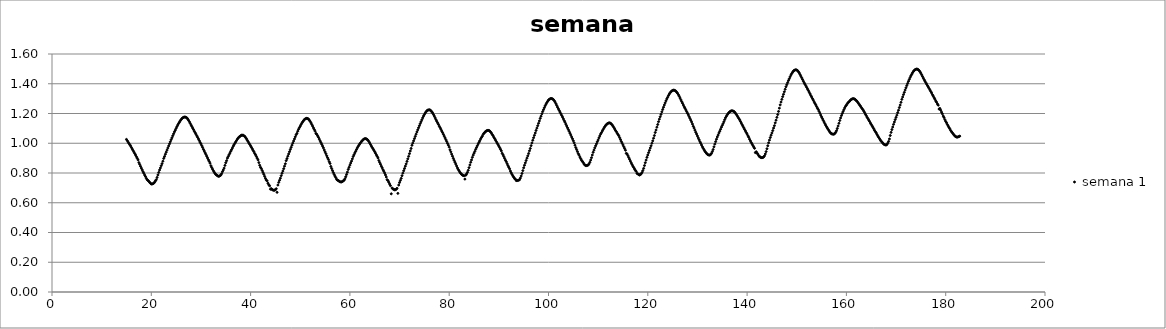
| Category | semana 1 |
|---|---|
| 15.0 | 1.026 |
| 15.16666 | 1.017 |
| 15.33332 | 1.008 |
| 15.49998 | 0.999 |
| 15.666640000000001 | 0.99 |
| 15.833300000000001 | 0.982 |
| 15.999960000000002 | 0.971 |
| 16.16662 | 0.961 |
| 16.333280000000002 | 0.951 |
| 16.499940000000002 | 0.941 |
| 16.666600000000003 | 0.931 |
| 16.833260000000003 | 0.921 |
| 16.999920000000003 | 0.91 |
| 17.166580000000003 | 0.899 |
| 17.333240000000004 | 0.888 |
| 17.499900000000004 | 0.87 |
| 17.666560000000004 | 0.858 |
| 17.833220000000004 | 0.845 |
| 17.999880000000005 | 0.833 |
| 18.166540000000005 | 0.821 |
| 18.333200000000005 | 0.809 |
| 18.499860000000005 | 0.798 |
| 18.666520000000006 | 0.786 |
| 18.833180000000006 | 0.776 |
| 18.999840000000006 | 0.764 |
| 19.166500000000006 | 0.755 |
| 19.333160000000007 | 0.75 |
| 19.499820000000007 | 0.744 |
| 19.666480000000007 | 0.737 |
| 19.833140000000007 | 0.731 |
| 19.999800000000008 | 0.726 |
| 20.166460000000008 | 0.726 |
| 20.333120000000008 | 0.728 |
| 20.49978000000001 | 0.732 |
| 20.66644000000001 | 0.738 |
| 20.83310000000001 | 0.747 |
| 20.99976000000001 | 0.755 |
| 21.16642000000001 | 0.77 |
| 21.33308000000001 | 0.787 |
| 21.49974000000001 | 0.804 |
| 21.66640000000001 | 0.82 |
| 21.83306000000001 | 0.834 |
| 21.99972000000001 | 0.849 |
| 22.16638000000001 | 0.863 |
| 22.33304000000001 | 0.879 |
| 22.49970000000001 | 0.898 |
| 22.66636000000001 | 0.911 |
| 22.833020000000012 | 0.926 |
| 22.999680000000012 | 0.94 |
| 23.166340000000012 | 0.954 |
| 23.333000000000013 | 0.968 |
| 23.499660000000013 | 0.982 |
| 23.666320000000013 | 0.996 |
| 23.832980000000013 | 1.01 |
| 23.999640000000014 | 1.024 |
| 24.166300000000014 | 1.037 |
| 24.332960000000014 | 1.051 |
| 24.499620000000014 | 1.064 |
| 24.666280000000015 | 1.077 |
| 24.832940000000015 | 1.088 |
| 24.999600000000015 | 1.1 |
| 25.166260000000015 | 1.112 |
| 25.332920000000016 | 1.123 |
| 25.499580000000016 | 1.133 |
| 25.666240000000016 | 1.142 |
| 25.832900000000016 | 1.151 |
| 25.999560000000017 | 1.159 |
| 26.166220000000017 | 1.166 |
| 26.332880000000017 | 1.171 |
| 26.499540000000017 | 1.174 |
| 26.666200000000018 | 1.176 |
| 26.832860000000018 | 1.176 |
| 26.999520000000018 | 1.174 |
| 27.16618000000002 | 1.17 |
| 27.33284000000002 | 1.163 |
| 27.49950000000002 | 1.155 |
| 27.66616000000002 | 1.145 |
| 27.83282000000002 | 1.134 |
| 27.99948000000002 | 1.123 |
| 28.16614000000002 | 1.113 |
| 28.33280000000002 | 1.102 |
| 28.49946000000002 | 1.092 |
| 28.66612000000002 | 1.081 |
| 28.83278000000002 | 1.071 |
| 28.99944000000002 | 1.061 |
| 29.16610000000002 | 1.05 |
| 29.33276000000002 | 1.04 |
| 29.499420000000022 | 1.029 |
| 29.666080000000022 | 1.018 |
| 29.832740000000022 | 1.006 |
| 29.999400000000023 | 0.996 |
| 30.166060000000023 | 0.984 |
| 30.332720000000023 | 0.972 |
| 30.499380000000023 | 0.959 |
| 30.666040000000024 | 0.948 |
| 30.832700000000024 | 0.936 |
| 30.999360000000024 | 0.925 |
| 31.166020000000024 | 0.913 |
| 31.332680000000025 | 0.901 |
| 31.499340000000025 | 0.889 |
| 31.666000000000025 | 0.878 |
| 31.832660000000025 | 0.866 |
| 31.999320000000026 | 0.849 |
| 32.165980000000026 | 0.837 |
| 32.332640000000026 | 0.826 |
| 32.49930000000003 | 0.815 |
| 32.66596000000003 | 0.806 |
| 32.83262000000003 | 0.797 |
| 32.99928000000003 | 0.79 |
| 33.16594000000003 | 0.786 |
| 33.33260000000003 | 0.782 |
| 33.49926000000003 | 0.778 |
| 33.66592000000003 | 0.778 |
| 33.83258000000003 | 0.782 |
| 33.99924000000003 | 0.786 |
| 34.16590000000003 | 0.795 |
| 34.33256000000003 | 0.809 |
| 34.49922000000003 | 0.82 |
| 34.66588000000003 | 0.833 |
| 34.83254000000003 | 0.851 |
| 34.99920000000003 | 0.869 |
| 35.16586000000003 | 0.883 |
| 35.33252000000003 | 0.9 |
| 35.49918000000003 | 0.911 |
| 35.66584000000003 | 0.923 |
| 35.83250000000003 | 0.934 |
| 35.99916000000003 | 0.946 |
| 36.16582000000003 | 0.957 |
| 36.33248000000003 | 0.968 |
| 36.49914000000003 | 0.98 |
| 36.66580000000003 | 0.99 |
| 36.83246000000003 | 1 |
| 36.99912000000003 | 1.009 |
| 37.165780000000034 | 1.018 |
| 37.332440000000034 | 1.028 |
| 37.499100000000034 | 1.035 |
| 37.665760000000034 | 1.041 |
| 37.832420000000035 | 1.046 |
| 37.999080000000035 | 1.05 |
| 38.165740000000035 | 1.054 |
| 38.332400000000035 | 1.054 |
| 38.499060000000036 | 1.054 |
| 38.665720000000036 | 1.05 |
| 38.832380000000036 | 1.046 |
| 38.999040000000036 | 1.038 |
| 39.16570000000004 | 1.03 |
| 39.33236000000004 | 1.02 |
| 39.49902000000004 | 1.011 |
| 39.66568000000004 | 1.001 |
| 39.83234000000004 | 0.992 |
| 39.99900000000004 | 0.982 |
| 40.16566000000004 | 0.973 |
| 40.33232000000004 | 0.963 |
| 40.49898000000004 | 0.952 |
| 40.66564000000004 | 0.943 |
| 40.83230000000004 | 0.931 |
| 40.99896000000004 | 0.922 |
| 41.16562000000004 | 0.911 |
| 41.33228000000004 | 0.899 |
| 41.49894000000004 | 0.888 |
| 41.66560000000004 | 0.87 |
| 41.83226000000004 | 0.852 |
| 41.99892000000004 | 0.838 |
| 42.16558000000004 | 0.83 |
| 42.33224000000004 | 0.817 |
| 42.49890000000004 | 0.804 |
| 42.66556000000004 | 0.791 |
| 42.83222000000004 | 0.777 |
| 42.99888000000004 | 0.763 |
| 43.16554000000004 | 0.752 |
| 43.33220000000004 | 0.747 |
| 43.49886000000004 | 0.731 |
| 43.66552000000004 | 0.72 |
| 43.832180000000044 | 0.714 |
| 43.998840000000044 | 0.691 |
| 44.165500000000044 | 0.695 |
| 44.332160000000044 | 0.689 |
| 44.498820000000045 | 0.685 |
| 44.665480000000045 | 0.684 |
| 44.832140000000045 | 0.684 |
| 44.998800000000045 | 0.688 |
| 45.165460000000046 | 0.694 |
| 45.332120000000046 | 0.67 |
| 45.498780000000046 | 0.719 |
| 45.665440000000046 | 0.737 |
| 45.83210000000005 | 0.751 |
| 45.99876000000005 | 0.765 |
| 46.16542000000005 | 0.782 |
| 46.33208000000005 | 0.798 |
| 46.49874000000005 | 0.813 |
| 46.66540000000005 | 0.829 |
| 46.83206000000005 | 0.846 |
| 46.99872000000005 | 0.862 |
| 47.16538000000005 | 0.883 |
| 47.33204000000005 | 0.897 |
| 47.49870000000005 | 0.913 |
| 47.66536000000005 | 0.928 |
| 47.83202000000005 | 0.943 |
| 47.99868000000005 | 0.958 |
| 48.16534000000005 | 0.972 |
| 48.33200000000005 | 0.987 |
| 48.49866000000005 | 1.001 |
| 48.66532000000005 | 1.015 |
| 48.83198000000005 | 1.029 |
| 48.99864000000005 | 1.043 |
| 49.16530000000005 | 1.057 |
| 49.33196000000005 | 1.066 |
| 49.49862000000005 | 1.081 |
| 49.66528000000005 | 1.094 |
| 49.83194000000005 | 1.105 |
| 49.99860000000005 | 1.115 |
| 50.16526000000005 | 1.126 |
| 50.33192000000005 | 1.136 |
| 50.498580000000054 | 1.144 |
| 50.665240000000054 | 1.152 |
| 50.831900000000054 | 1.159 |
| 50.998560000000055 | 1.164 |
| 51.165220000000055 | 1.166 |
| 51.331880000000055 | 1.168 |
| 51.498540000000055 | 1.166 |
| 51.665200000000056 | 1.162 |
| 51.831860000000056 | 1.155 |
| 51.998520000000056 | 1.147 |
| 52.165180000000056 | 1.137 |
| 52.33184000000006 | 1.126 |
| 52.49850000000006 | 1.115 |
| 52.66516000000006 | 1.103 |
| 52.83182000000006 | 1.092 |
| 52.99848000000006 | 1.081 |
| 53.16514000000006 | 1.066 |
| 53.33180000000006 | 1.06 |
| 53.49846000000006 | 1.05 |
| 53.66512000000006 | 1.04 |
| 53.83178000000006 | 1.028 |
| 53.99844000000006 | 1.016 |
| 54.16510000000006 | 1.005 |
| 54.33176000000006 | 0.993 |
| 54.49842000000006 | 0.981 |
| 54.66508000000006 | 0.969 |
| 54.83174000000006 | 0.955 |
| 54.99840000000006 | 0.942 |
| 55.16506000000006 | 0.93 |
| 55.33172000000006 | 0.916 |
| 55.49838000000006 | 0.903 |
| 55.66504000000006 | 0.891 |
| 55.83170000000006 | 0.876 |
| 55.99836000000006 | 0.864 |
| 56.16502000000006 | 0.844 |
| 56.33168000000006 | 0.83 |
| 56.49834000000006 | 0.816 |
| 56.66500000000006 | 0.803 |
| 56.83166000000006 | 0.79 |
| 56.998320000000064 | 0.779 |
| 57.164980000000064 | 0.769 |
| 57.331640000000064 | 0.757 |
| 57.498300000000064 | 0.752 |
| 57.664960000000065 | 0.749 |
| 57.831620000000065 | 0.745 |
| 57.998280000000065 | 0.741 |
| 58.164940000000065 | 0.74 |
| 58.331600000000066 | 0.74 |
| 58.498260000000066 | 0.743 |
| 58.664920000000066 | 0.748 |
| 58.831580000000066 | 0.751 |
| 58.99824000000007 | 0.761 |
| 59.16490000000007 | 0.775 |
| 59.33156000000007 | 0.79 |
| 59.49822000000007 | 0.806 |
| 59.66488000000007 | 0.824 |
| 59.83154000000007 | 0.838 |
| 59.99820000000007 | 0.853 |
| 60.16486000000007 | 0.867 |
| 60.33152000000007 | 0.88 |
| 60.49818000000007 | 0.895 |
| 60.66484000000007 | 0.911 |
| 60.83150000000007 | 0.923 |
| 60.99816000000007 | 0.935 |
| 61.16482000000007 | 0.946 |
| 61.33148000000007 | 0.958 |
| 61.49814000000007 | 0.969 |
| 61.66480000000007 | 0.979 |
| 61.83146000000007 | 0.988 |
| 61.99812000000007 | 0.996 |
| 62.16478000000007 | 1.004 |
| 62.33144000000007 | 1.012 |
| 62.49810000000007 | 1.017 |
| 62.66476000000007 | 1.024 |
| 62.83142000000007 | 1.028 |
| 62.99808000000007 | 1.031 |
| 63.16474000000007 | 1.031 |
| 63.33140000000007 | 1.029 |
| 63.49806000000007 | 1.025 |
| 63.664720000000074 | 1.019 |
| 63.831380000000074 | 1.011 |
| 63.998040000000074 | 1.001 |
| 64.16470000000007 | 0.991 |
| 64.33136000000006 | 0.981 |
| 64.49802000000005 | 0.971 |
| 64.66468000000005 | 0.962 |
| 64.83134000000004 | 0.953 |
| 64.99800000000003 | 0.943 |
| 65.16466000000003 | 0.933 |
| 65.33132000000002 | 0.922 |
| 65.49798000000001 | 0.912 |
| 65.66464 | 0.901 |
| 65.8313 | 0.884 |
| 65.99795999999999 | 0.871 |
| 66.16461999999999 | 0.859 |
| 66.33127999999998 | 0.846 |
| 66.49793999999997 | 0.835 |
| 66.66459999999996 | 0.822 |
| 66.83125999999996 | 0.812 |
| 66.99791999999995 | 0.8 |
| 67.16457999999994 | 0.787 |
| 67.33123999999994 | 0.773 |
| 67.49789999999993 | 0.755 |
| 67.66455999999992 | 0.749 |
| 67.83121999999992 | 0.738 |
| 67.99787999999991 | 0.726 |
| 68.1645399999999 | 0.715 |
| 68.3311999999999 | 0.66 |
| 68.49785999999989 | 0.699 |
| 68.66451999999988 | 0.693 |
| 68.83117999999988 | 0.69 |
| 68.99783999999987 | 0.687 |
| 69.16449999999986 | 0.688 |
| 69.33115999999985 | 0.691 |
| 69.49781999999985 | 0.697 |
| 69.66447999999984 | 0.663 |
| 69.83113999999983 | 0.719 |
| 69.99779999999983 | 0.736 |
| 70.16445999999982 | 0.75 |
| 70.33111999999981 | 0.764 |
| 70.4977799999998 | 0.782 |
| 70.6644399999998 | 0.799 |
| 70.8310999999998 | 0.815 |
| 70.99775999999979 | 0.83 |
| 71.16441999999978 | 0.846 |
| 71.33107999999977 | 0.861 |
| 71.49773999999977 | 0.878 |
| 71.66439999999976 | 0.895 |
| 71.83105999999975 | 0.912 |
| 71.99771999999975 | 0.93 |
| 72.16437999999974 | 0.948 |
| 72.33103999999973 | 0.965 |
| 72.49769999999972 | 0.986 |
| 72.66435999999972 | 1.001 |
| 72.83101999999971 | 1.016 |
| 72.9976799999997 | 1.031 |
| 73.1643399999997 | 1.046 |
| 73.33099999999969 | 1.061 |
| 73.49765999999968 | 1.076 |
| 73.66431999999968 | 1.09 |
| 73.83097999999967 | 1.104 |
| 73.99763999999966 | 1.118 |
| 74.16429999999966 | 1.132 |
| 74.33095999999965 | 1.145 |
| 74.49761999999964 | 1.158 |
| 74.66427999999964 | 1.171 |
| 74.83093999999963 | 1.183 |
| 74.99759999999962 | 1.193 |
| 75.16425999999962 | 1.203 |
| 75.33091999999961 | 1.211 |
| 75.4975799999996 | 1.218 |
| 75.6642399999996 | 1.222 |
| 75.83089999999959 | 1.224 |
| 75.99755999999958 | 1.225 |
| 76.16421999999957 | 1.223 |
| 76.33087999999957 | 1.218 |
| 76.49753999999956 | 1.211 |
| 76.66419999999955 | 1.204 |
| 76.83085999999955 | 1.193 |
| 76.99751999999954 | 1.183 |
| 77.16417999999953 | 1.171 |
| 77.33083999999953 | 1.159 |
| 77.49749999999952 | 1.148 |
| 77.66415999999951 | 1.137 |
| 77.8308199999995 | 1.127 |
| 77.9974799999995 | 1.115 |
| 78.16413999999949 | 1.105 |
| 78.33079999999948 | 1.094 |
| 78.49745999999948 | 1.082 |
| 78.66411999999947 | 1.072 |
| 78.83077999999946 | 1.06 |
| 78.99743999999946 | 1.048 |
| 79.16409999999945 | 1.036 |
| 79.33075999999944 | 1.024 |
| 79.49741999999944 | 1.012 |
| 79.66407999999943 | 0.999 |
| 79.83073999999942 | 0.987 |
| 79.99739999999942 | 0.974 |
| 80.16405999999941 | 0.956 |
| 80.3307199999994 | 0.942 |
| 80.4973799999994 | 0.927 |
| 80.66403999999939 | 0.913 |
| 80.83069999999938 | 0.898 |
| 80.99735999999938 | 0.885 |
| 81.16401999999937 | 0.872 |
| 81.33067999999936 | 0.86 |
| 81.49733999999935 | 0.847 |
| 81.66399999999935 | 0.834 |
| 81.83065999999934 | 0.823 |
| 81.99731999999933 | 0.814 |
| 82.16397999999933 | 0.805 |
| 82.33063999999932 | 0.797 |
| 82.49729999999931 | 0.791 |
| 82.6639599999993 | 0.786 |
| 82.8306199999993 | 0.783 |
| 82.9972799999993 | 0.782 |
| 83.16393999999929 | 0.759 |
| 83.33059999999928 | 0.785 |
| 83.49725999999927 | 0.793 |
| 83.66391999999927 | 0.804 |
| 83.83057999999926 | 0.818 |
| 83.99723999999925 | 0.836 |
| 84.16389999999924 | 0.854 |
| 84.33055999999924 | 0.872 |
| 84.49721999999923 | 0.888 |
| 84.66387999999922 | 0.905 |
| 84.83053999999922 | 0.92 |
| 84.99719999999921 | 0.933 |
| 85.1638599999992 | 0.945 |
| 85.3305199999992 | 0.959 |
| 85.49717999999919 | 0.971 |
| 85.66383999999918 | 0.983 |
| 85.83049999999918 | 0.995 |
| 85.99715999999917 | 1.006 |
| 86.16381999999916 | 1.017 |
| 86.33047999999916 | 1.029 |
| 86.49713999999915 | 1.039 |
| 86.66379999999914 | 1.047 |
| 86.83045999999914 | 1.059 |
| 86.99711999999913 | 1.067 |
| 87.16377999999912 | 1.073 |
| 87.33043999999911 | 1.079 |
| 87.49709999999911 | 1.083 |
| 87.6637599999991 | 1.086 |
| 87.8304199999991 | 1.087 |
| 87.99707999999909 | 1.086 |
| 88.16373999999908 | 1.082 |
| 88.33039999999907 | 1.076 |
| 88.49705999999907 | 1.069 |
| 88.66371999999906 | 1.059 |
| 88.83037999999905 | 1.051 |
| 88.99703999999905 | 1.04 |
| 89.16369999999904 | 1.031 |
| 89.33035999999903 | 1.021 |
| 89.49701999999903 | 1.011 |
| 89.66367999999902 | 1.001 |
| 89.83033999999901 | 0.991 |
| 89.996999999999 | 0.981 |
| 90.163659999999 | 0.971 |
| 90.33031999999899 | 0.96 |
| 90.49697999999898 | 0.949 |
| 90.66363999999898 | 0.933 |
| 90.83029999999897 | 0.923 |
| 90.99695999999896 | 0.911 |
| 91.16361999999896 | 0.898 |
| 91.33027999999895 | 0.886 |
| 91.49693999999894 | 0.876 |
| 91.66359999999894 | 0.863 |
| 91.83025999999893 | 0.85 |
| 91.99691999999892 | 0.839 |
| 92.16357999999892 | 0.828 |
| 92.33023999999891 | 0.813 |
| 92.4968999999989 | 0.801 |
| 92.6635599999989 | 0.79 |
| 92.83021999999889 | 0.78 |
| 92.99687999999888 | 0.772 |
| 93.16353999999887 | 0.763 |
| 93.33019999999887 | 0.759 |
| 93.49685999999886 | 0.749 |
| 93.66351999999885 | 0.75 |
| 93.83017999999885 | 0.75 |
| 93.99683999999884 | 0.752 |
| 94.16349999999883 | 0.755 |
| 94.33015999999883 | 0.766 |
| 94.49681999999882 | 0.78 |
| 94.66347999999881 | 0.797 |
| 94.8301399999988 | 0.816 |
| 94.9967999999988 | 0.835 |
| 95.16345999999879 | 0.852 |
| 95.33011999999879 | 0.868 |
| 95.49677999999878 | 0.884 |
| 95.66343999999877 | 0.9 |
| 95.83009999999877 | 0.915 |
| 95.99675999999876 | 0.931 |
| 96.16341999999875 | 0.949 |
| 96.33007999999874 | 0.965 |
| 96.49673999999874 | 0.984 |
| 96.66339999999873 | 1.002 |
| 96.83005999999872 | 1.02 |
| 96.99671999999872 | 1.037 |
| 97.16337999999871 | 1.053 |
| 97.3300399999987 | 1.069 |
| 97.4966999999987 | 1.086 |
| 97.66335999999869 | 1.102 |
| 97.83001999999868 | 1.118 |
| 97.99667999999868 | 1.134 |
| 98.16333999999867 | 1.15 |
| 98.32999999999866 | 1.167 |
| 98.49665999999866 | 1.182 |
| 98.66331999999865 | 1.198 |
| 98.82997999999864 | 1.213 |
| 98.99663999999864 | 1.226 |
| 99.16329999999863 | 1.239 |
| 99.32995999999862 | 1.252 |
| 99.49661999999861 | 1.263 |
| 99.66327999999861 | 1.273 |
| 99.8299399999986 | 1.282 |
| 99.9965999999986 | 1.29 |
| 100.16325999999859 | 1.295 |
| 100.32991999999858 | 1.299 |
| 100.49657999999857 | 1.301 |
| 100.66323999999857 | 1.3 |
| 100.82989999999856 | 1.298 |
| 100.99655999999855 | 1.293 |
| 101.16321999999855 | 1.286 |
| 101.32987999999854 | 1.277 |
| 101.49653999999853 | 1.266 |
| 101.66319999999853 | 1.254 |
| 101.82985999999852 | 1.242 |
| 101.99651999999851 | 1.231 |
| 102.1631799999985 | 1.22 |
| 102.3298399999985 | 1.209 |
| 102.49649999999849 | 1.198 |
| 102.66315999999848 | 1.187 |
| 102.82981999999848 | 1.176 |
| 102.99647999999847 | 1.164 |
| 103.16313999999846 | 1.152 |
| 103.32979999999846 | 1.141 |
| 103.49645999999845 | 1.128 |
| 103.66311999999844 | 1.116 |
| 103.82977999999844 | 1.104 |
| 103.99643999999843 | 1.092 |
| 104.16309999999842 | 1.08 |
| 104.32975999999842 | 1.067 |
| 104.49641999999841 | 1.055 |
| 104.6630799999984 | 1.042 |
| 104.8297399999984 | 1.03 |
| 104.99639999999839 | 1.017 |
| 105.16305999999838 | 1.003 |
| 105.32971999999837 | 0.987 |
| 105.49637999999837 | 0.971 |
| 105.66303999999836 | 0.958 |
| 105.82969999999835 | 0.944 |
| 105.99635999999835 | 0.93 |
| 106.16301999999834 | 0.92 |
| 106.32967999999833 | 0.907 |
| 106.49633999999833 | 0.896 |
| 106.66299999999832 | 0.885 |
| 106.82965999999831 | 0.878 |
| 106.9963199999983 | 0.87 |
| 107.1629799999983 | 0.86 |
| 107.32963999999829 | 0.854 |
| 107.49629999999829 | 0.85 |
| 107.66295999999828 | 0.85 |
| 107.82961999999827 | 0.851 |
| 107.99627999999826 | 0.854 |
| 108.16293999999826 | 0.861 |
| 108.32959999999825 | 0.872 |
| 108.49625999999824 | 0.887 |
| 108.66291999999824 | 0.903 |
| 108.82957999999823 | 0.921 |
| 108.99623999999822 | 0.939 |
| 109.16289999999822 | 0.954 |
| 109.32955999999821 | 0.969 |
| 109.4962199999982 | 0.983 |
| 109.6628799999982 | 0.996 |
| 109.82953999999819 | 1.01 |
| 109.99619999999818 | 1.022 |
| 110.16285999999818 | 1.036 |
| 110.32951999999817 | 1.049 |
| 110.49617999999816 | 1.062 |
| 110.66283999999816 | 1.071 |
| 110.82949999999815 | 1.082 |
| 110.99615999999814 | 1.092 |
| 111.16281999999813 | 1.102 |
| 111.32947999999813 | 1.111 |
| 111.49613999999812 | 1.119 |
| 111.66279999999811 | 1.125 |
| 111.82945999999811 | 1.131 |
| 111.9961199999981 | 1.134 |
| 112.1627799999981 | 1.137 |
| 112.32943999999809 | 1.137 |
| 112.49609999999808 | 1.134 |
| 112.66275999999807 | 1.129 |
| 112.82941999999807 | 1.123 |
| 112.99607999999806 | 1.115 |
| 113.16273999999805 | 1.106 |
| 113.32939999999805 | 1.096 |
| 113.49605999999804 | 1.086 |
| 113.66271999999803 | 1.078 |
| 113.82937999999803 | 1.068 |
| 113.99603999999802 | 1.059 |
| 114.16269999999801 | 1.05 |
| 114.329359999998 | 1.038 |
| 114.496019999998 | 1.025 |
| 114.66267999999799 | 1.012 |
| 114.82933999999798 | 1.001 |
| 114.99599999999798 | 0.989 |
| 115.16265999999797 | 0.977 |
| 115.32931999999796 | 0.965 |
| 115.49597999999796 | 0.953 |
| 115.66263999999795 | 0.932 |
| 115.82929999999794 | 0.928 |
| 115.99595999999794 | 0.917 |
| 116.16261999999793 | 0.904 |
| 116.32927999999792 | 0.892 |
| 116.49593999999792 | 0.88 |
| 116.66259999999791 | 0.868 |
| 116.8292599999979 | 0.857 |
| 116.9959199999979 | 0.846 |
| 117.16257999999789 | 0.837 |
| 117.32923999999788 | 0.827 |
| 117.49589999999787 | 0.818 |
| 117.66255999999787 | 0.811 |
| 117.82921999999786 | 0.797 |
| 117.99587999999785 | 0.794 |
| 118.16253999999785 | 0.79 |
| 118.32919999999784 | 0.786 |
| 118.49585999999783 | 0.79 |
| 118.66251999999783 | 0.794 |
| 118.82917999999782 | 0.803 |
| 118.99583999999781 | 0.816 |
| 119.1624999999978 | 0.831 |
| 119.3291599999978 | 0.85 |
| 119.49581999999779 | 0.869 |
| 119.66247999999779 | 0.887 |
| 119.82913999999778 | 0.905 |
| 119.99579999999777 | 0.921 |
| 120.16245999999776 | 0.937 |
| 120.32911999999776 | 0.952 |
| 120.49577999999775 | 0.968 |
| 120.66243999999774 | 0.983 |
| 120.82909999999774 | 1 |
| 120.99575999999773 | 1.016 |
| 121.16241999999772 | 1.034 |
| 121.32907999999772 | 1.052 |
| 121.49573999999771 | 1.072 |
| 121.6623999999977 | 1.089 |
| 121.8290599999977 | 1.108 |
| 121.99571999999769 | 1.126 |
| 122.16237999999768 | 1.145 |
| 122.32903999999768 | 1.162 |
| 122.49569999999767 | 1.178 |
| 122.66235999999766 | 1.194 |
| 122.82901999999766 | 1.211 |
| 122.99567999999765 | 1.227 |
| 123.16233999999764 | 1.242 |
| 123.32899999999763 | 1.257 |
| 123.49565999999763 | 1.271 |
| 123.66231999999762 | 1.285 |
| 123.82897999999761 | 1.298 |
| 123.99563999999761 | 1.309 |
| 124.1622999999976 | 1.321 |
| 124.3289599999976 | 1.331 |
| 124.49561999999759 | 1.339 |
| 124.66227999999758 | 1.346 |
| 124.82893999999757 | 1.351 |
| 124.99559999999757 | 1.355 |
| 125.16225999999756 | 1.357 |
| 125.32891999999755 | 1.356 |
| 125.49557999999755 | 1.354 |
| 125.66223999999754 | 1.35 |
| 125.82889999999753 | 1.343 |
| 125.99555999999752 | 1.336 |
| 126.16221999999752 | 1.326 |
| 126.32887999999751 | 1.316 |
| 126.4955399999975 | 1.304 |
| 126.6621999999975 | 1.292 |
| 126.82885999999749 | 1.28 |
| 126.99551999999748 | 1.269 |
| 127.16217999999748 | 1.257 |
| 127.32883999999747 | 1.245 |
| 127.49549999999746 | 1.235 |
| 127.66215999999746 | 1.224 |
| 127.82881999999745 | 1.213 |
| 127.99547999999744 | 1.202 |
| 128.16213999999744 | 1.191 |
| 128.32879999999744 | 1.179 |
| 128.49545999999745 | 1.167 |
| 128.66211999999746 | 1.155 |
| 128.82877999999747 | 1.143 |
| 128.99543999999747 | 1.129 |
| 129.16209999999748 | 1.114 |
| 129.3287599999975 | 1.102 |
| 129.4954199999975 | 1.088 |
| 129.6620799999975 | 1.074 |
| 129.8287399999975 | 1.062 |
| 129.99539999999752 | 1.049 |
| 130.16205999999752 | 1.036 |
| 130.32871999999753 | 1.024 |
| 130.49537999999754 | 1.011 |
| 130.66203999999755 | 1 |
| 130.82869999999755 | 0.988 |
| 130.99535999999756 | 0.976 |
| 131.16201999999757 | 0.966 |
| 131.32867999999758 | 0.956 |
| 131.49533999999758 | 0.947 |
| 131.6619999999976 | 0.939 |
| 131.8286599999976 | 0.932 |
| 131.9953199999976 | 0.926 |
| 132.1619799999976 | 0.922 |
| 132.32863999999762 | 0.921 |
| 132.49529999999763 | 0.92 |
| 132.66195999999763 | 0.925 |
| 132.82861999999764 | 0.932 |
| 132.99527999999765 | 0.944 |
| 133.16193999999766 | 0.958 |
| 133.32859999999766 | 0.976 |
| 133.49525999999767 | 0.994 |
| 133.66191999999768 | 1.011 |
| 133.8285799999977 | 1.027 |
| 133.9952399999977 | 1.042 |
| 134.1618999999977 | 1.055 |
| 134.3285599999977 | 1.069 |
| 134.49521999999772 | 1.081 |
| 134.66187999999772 | 1.094 |
| 134.82853999999773 | 1.108 |
| 134.99519999999774 | 1.12 |
| 135.16185999999774 | 1.132 |
| 135.32851999999775 | 1.145 |
| 135.49517999999776 | 1.159 |
| 135.66183999999777 | 1.172 |
| 135.82849999999777 | 1.182 |
| 135.99515999999778 | 1.191 |
| 136.1618199999978 | 1.199 |
| 136.3284799999978 | 1.206 |
| 136.4951399999978 | 1.211 |
| 136.6617999999978 | 1.215 |
| 136.82845999999782 | 1.218 |
| 136.99511999999783 | 1.218 |
| 137.16177999999783 | 1.217 |
| 137.32843999999784 | 1.214 |
| 137.49509999999785 | 1.209 |
| 137.66175999999786 | 1.202 |
| 137.82841999999786 | 1.194 |
| 137.99507999999787 | 1.185 |
| 138.16173999999788 | 1.176 |
| 138.32839999999788 | 1.167 |
| 138.4950599999979 | 1.158 |
| 138.6617199999979 | 1.147 |
| 138.8283799999979 | 1.136 |
| 138.9950399999979 | 1.125 |
| 139.16169999999792 | 1.115 |
| 139.32835999999793 | 1.104 |
| 139.49501999999794 | 1.093 |
| 139.66167999999794 | 1.083 |
| 139.82833999999795 | 1.072 |
| 140.0 | 1.062 |
| 140.16666 | 1.05 |
| 140.33332000000001 | 1.04 |
| 140.49998000000002 | 1.027 |
| 140.66664000000003 | 1.016 |
| 140.83330000000004 | 1.005 |
| 140.99996000000004 | 0.995 |
| 141.16662000000005 | 0.985 |
| 141.33328000000006 | 0.975 |
| 141.49994000000007 | 0.966 |
| 141.66660000000007 | 0.937 |
| 141.83326000000008 | 0.943 |
| 141.9999200000001 | 0.934 |
| 142.1665800000001 | 0.927 |
| 142.3332400000001 | 0.917 |
| 142.4999000000001 | 0.91 |
| 142.66656000000012 | 0.907 |
| 142.83322000000013 | 0.903 |
| 142.99988000000013 | 0.903 |
| 143.16654000000014 | 0.904 |
| 143.33320000000015 | 0.908 |
| 143.49986000000015 | 0.915 |
| 143.66652000000016 | 0.928 |
| 143.83318000000017 | 0.944 |
| 143.99984000000018 | 0.963 |
| 144.16650000000018 | 0.983 |
| 144.3331600000002 | 1.003 |
| 144.4998200000002 | 1.021 |
| 144.6664800000002 | 1.038 |
| 144.8331400000002 | 1.054 |
| 144.99980000000022 | 1.069 |
| 145.16646000000023 | 1.085 |
| 145.33312000000024 | 1.102 |
| 145.49978000000024 | 1.118 |
| 145.66644000000025 | 1.137 |
| 145.83310000000026 | 1.155 |
| 145.99976000000026 | 1.174 |
| 146.16642000000027 | 1.193 |
| 146.33308000000028 | 1.214 |
| 146.4997400000003 | 1.236 |
| 146.6664000000003 | 1.258 |
| 146.8330600000003 | 1.277 |
| 146.9997200000003 | 1.295 |
| 147.16638000000032 | 1.313 |
| 147.33304000000032 | 1.329 |
| 147.49970000000033 | 1.346 |
| 147.66636000000034 | 1.363 |
| 147.83302000000035 | 1.38 |
| 147.99968000000035 | 1.394 |
| 148.16634000000036 | 1.408 |
| 148.33300000000037 | 1.422 |
| 148.49966000000038 | 1.434 |
| 148.66632000000038 | 1.447 |
| 148.8329800000004 | 1.459 |
| 148.9996400000004 | 1.469 |
| 149.1663000000004 | 1.478 |
| 149.3329600000004 | 1.485 |
| 149.49962000000042 | 1.49 |
| 149.66628000000043 | 1.493 |
| 149.83294000000043 | 1.494 |
| 149.99960000000044 | 1.492 |
| 150.16626000000045 | 1.488 |
| 150.33292000000046 | 1.481 |
| 150.49958000000046 | 1.473 |
| 150.66624000000047 | 1.462 |
| 150.83290000000048 | 1.451 |
| 150.99956000000049 | 1.44 |
| 151.1662200000005 | 1.429 |
| 151.3328800000005 | 1.417 |
| 151.4995400000005 | 1.406 |
| 151.66620000000052 | 1.396 |
| 151.83286000000052 | 1.386 |
| 151.99952000000053 | 1.376 |
| 152.16618000000054 | 1.365 |
| 152.33284000000054 | 1.355 |
| 152.49950000000055 | 1.344 |
| 152.66616000000056 | 1.333 |
| 152.83282000000057 | 1.321 |
| 152.99948000000057 | 1.311 |
| 153.16614000000058 | 1.3 |
| 153.3328000000006 | 1.29 |
| 153.4994600000006 | 1.278 |
| 153.6661200000006 | 1.268 |
| 153.8327800000006 | 1.258 |
| 153.99944000000062 | 1.247 |
| 154.16610000000063 | 1.236 |
| 154.33276000000063 | 1.227 |
| 154.49942000000064 | 1.214 |
| 154.66608000000065 | 1.202 |
| 154.83274000000065 | 1.189 |
| 154.99940000000066 | 1.177 |
| 155.16606000000067 | 1.166 |
| 155.33272000000068 | 1.154 |
| 155.49938000000068 | 1.143 |
| 155.6660400000007 | 1.132 |
| 155.8327000000007 | 1.121 |
| 155.9993600000007 | 1.111 |
| 156.1660200000007 | 1.102 |
| 156.33268000000072 | 1.093 |
| 156.49934000000073 | 1.084 |
| 156.66600000000074 | 1.075 |
| 156.83266000000074 | 1.069 |
| 156.99932000000075 | 1.064 |
| 157.16598000000076 | 1.062 |
| 157.33264000000077 | 1.061 |
| 157.49930000000077 | 1.061 |
| 157.66596000000078 | 1.066 |
| 157.8326200000008 | 1.073 |
| 157.9992800000008 | 1.084 |
| 158.1659400000008 | 1.099 |
| 158.3326000000008 | 1.116 |
| 158.49926000000082 | 1.134 |
| 158.66592000000082 | 1.153 |
| 158.83258000000083 | 1.17 |
| 158.99924000000084 | 1.186 |
| 159.16590000000085 | 1.2 |
| 159.33256000000085 | 1.213 |
| 159.49922000000086 | 1.226 |
| 159.66588000000087 | 1.238 |
| 159.83254000000088 | 1.249 |
| 159.99920000000088 | 1.256 |
| 160.1658600000009 | 1.265 |
| 160.3325200000009 | 1.273 |
| 160.4991800000009 | 1.278 |
| 160.6658400000009 | 1.284 |
| 160.83250000000092 | 1.29 |
| 160.99916000000093 | 1.295 |
| 161.16582000000093 | 1.298 |
| 161.33248000000094 | 1.3 |
| 161.49914000000095 | 1.299 |
| 161.66580000000096 | 1.297 |
| 161.83246000000096 | 1.292 |
| 161.99912000000097 | 1.287 |
| 162.16578000000098 | 1.281 |
| 162.332440000001 | 1.273 |
| 162.499100000001 | 1.265 |
| 162.665760000001 | 1.257 |
| 162.832420000001 | 1.25 |
| 162.99908000000102 | 1.241 |
| 163.16574000000102 | 1.233 |
| 163.33240000000103 | 1.225 |
| 163.49906000000104 | 1.216 |
| 163.66572000000104 | 1.207 |
| 163.83238000000105 | 1.195 |
| 163.99904000000106 | 1.186 |
| 164.16570000000107 | 1.175 |
| 164.33236000000107 | 1.166 |
| 164.49902000000108 | 1.156 |
| 164.6656800000011 | 1.147 |
| 164.8323400000011 | 1.136 |
| 164.9990000000011 | 1.127 |
| 165.1656600000011 | 1.117 |
| 165.33232000000112 | 1.108 |
| 165.49898000000113 | 1.098 |
| 165.66564000000113 | 1.087 |
| 165.83230000000114 | 1.078 |
| 165.99896000000115 | 1.07 |
| 166.16562000000116 | 1.059 |
| 166.33228000000116 | 1.049 |
| 166.49894000000117 | 1.04 |
| 166.66560000000118 | 1.031 |
| 166.83226000000118 | 1.022 |
| 166.9989200000012 | 1.014 |
| 167.1655800000012 | 1.008 |
| 167.3322400000012 | 1.001 |
| 167.4989000000012 | 0.995 |
| 167.66556000000122 | 0.991 |
| 167.83222000000123 | 0.989 |
| 167.99888000000124 | 0.988 |
| 168.16554000000124 | 0.992 |
| 168.33220000000125 | 1.001 |
| 168.49886000000126 | 1.012 |
| 168.66552000000127 | 1.029 |
| 168.83218000000127 | 1.052 |
| 168.99884000000128 | 1.073 |
| 169.1655000000013 | 1.092 |
| 169.3321600000013 | 1.109 |
| 169.4988200000013 | 1.127 |
| 169.6654800000013 | 1.143 |
| 169.83214000000132 | 1.159 |
| 169.99880000000132 | 1.174 |
| 170.16546000000133 | 1.189 |
| 170.33212000000134 | 1.206 |
| 170.49878000000135 | 1.222 |
| 170.66544000000135 | 1.24 |
| 170.83210000000136 | 1.257 |
| 170.99876000000137 | 1.275 |
| 171.16542000000138 | 1.295 |
| 171.33208000000138 | 1.311 |
| 171.4987400000014 | 1.327 |
| 171.6654000000014 | 1.342 |
| 171.8320600000014 | 1.358 |
| 171.9987200000014 | 1.373 |
| 172.16538000000142 | 1.388 |
| 172.33204000000143 | 1.402 |
| 172.49870000000143 | 1.416 |
| 172.66536000000144 | 1.429 |
| 172.83202000000145 | 1.442 |
| 172.99868000000146 | 1.454 |
| 173.16534000000146 | 1.464 |
| 173.33200000000147 | 1.474 |
| 173.49866000000148 | 1.483 |
| 173.6653200000015 | 1.489 |
| 173.8319800000015 | 1.495 |
| 173.9986400000015 | 1.497 |
| 174.1653000000015 | 1.499 |
| 174.33196000000152 | 1.497 |
| 174.49862000000152 | 1.494 |
| 174.66528000000153 | 1.488 |
| 174.83194000000154 | 1.48 |
| 174.99860000000155 | 1.471 |
| 175.16526000000155 | 1.46 |
| 175.33192000000156 | 1.449 |
| 175.49858000000157 | 1.438 |
| 175.66524000000157 | 1.427 |
| 175.83190000000158 | 1.417 |
| 175.9985600000016 | 1.407 |
| 176.1652200000016 | 1.397 |
| 176.3318800000016 | 1.387 |
| 176.4985400000016 | 1.378 |
| 176.66520000000162 | 1.368 |
| 176.83186000000163 | 1.358 |
| 176.99852000000163 | 1.348 |
| 177.16518000000164 | 1.338 |
| 177.33184000000165 | 1.326 |
| 177.49850000000166 | 1.317 |
| 177.66516000000166 | 1.306 |
| 177.83182000000167 | 1.296 |
| 177.99848000000168 | 1.284 |
| 178.16514000000168 | 1.276 |
| 178.3318000000017 | 1.264 |
| 178.4984600000017 | 1.256 |
| 178.6651200000017 | 1.23 |
| 178.83178000000171 | 1.234 |
| 178.99844000000172 | 1.222 |
| 179.16510000000173 | 1.209 |
| 179.33176000000174 | 1.198 |
| 179.49842000000174 | 1.183 |
| 179.66508000000175 | 1.173 |
| 179.83174000000176 | 1.159 |
| 179.99840000000177 | 1.147 |
| 180.16506000000177 | 1.138 |
| 180.33172000000178 | 1.126 |
| 180.4983800000018 | 1.116 |
| 180.6650400000018 | 1.106 |
| 180.8317000000018 | 1.097 |
| 180.9983600000018 | 1.086 |
| 181.16502000000182 | 1.078 |
| 181.33168000000182 | 1.071 |
| 181.49834000000183 | 1.063 |
| 181.66500000000184 | 1.056 |
| 181.83166000000185 | 1.05 |
| 181.99832000000185 | 1.045 |
| 182.16498000000186 | 1.042 |
| 182.33164000000187 | 1.041 |
| 182.49830000000188 | 1.043 |
| 182.66496000000188 | 1.045 |
| 182.8316200000019 | 1.048 |